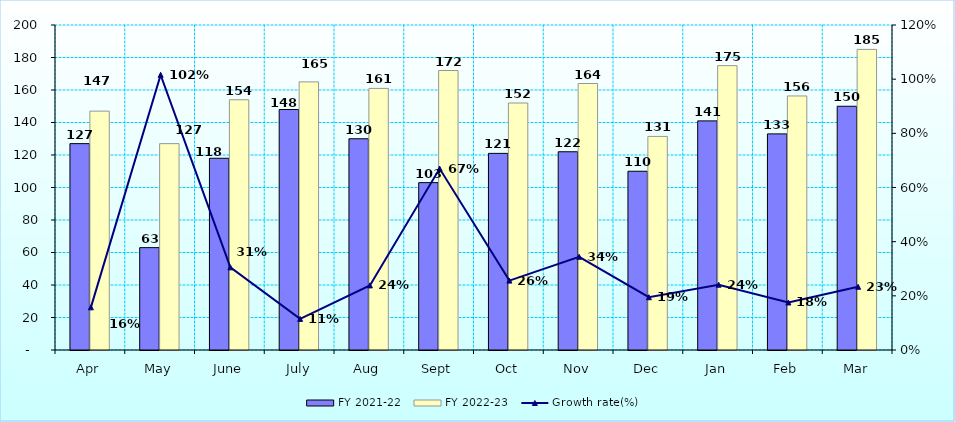
| Category | FY 2021-22 | FY 2022-23 |
|---|---|---|
| Apr | 127 | 147 |
| May | 63 | 127 |
| June | 118 | 154 |
| July | 148 | 165 |
| Aug | 130 | 161 |
| Sept | 103 | 172 |
| Oct | 121 | 152 |
| Nov | 122 | 164 |
| Dec | 110 | 131.435 |
| Jan | 141 | 175 |
| Feb | 133 | 156.333 |
| Mar | 150 | 185 |